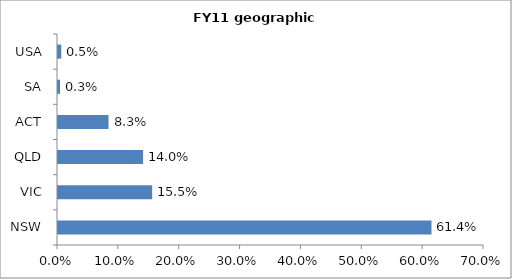
| Category | Series 0 |
|---|---|
| NSW | 0.614 |
| VIC | 0.155 |
| QLD | 0.14 |
| ACT | 0.083 |
| SA | 0.003 |
| USA | 0.005 |